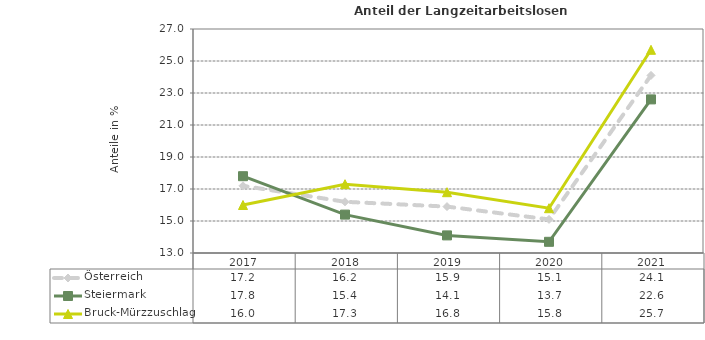
| Category | Österreich | Steiermark | Bruck-Mürzzuschlag |
|---|---|---|---|
| 2021.0 | 24.1 | 22.6 | 25.7 |
| 2020.0 | 15.1 | 13.7 | 15.8 |
| 2019.0 | 15.9 | 14.1 | 16.8 |
| 2018.0 | 16.2 | 15.4 | 17.3 |
| 2017.0 | 17.2 | 17.8 | 16 |